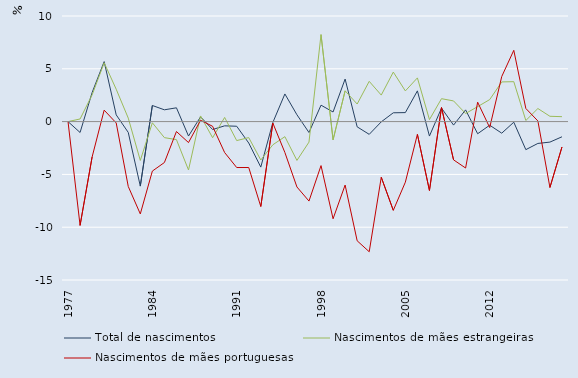
| Category | Total de nascimentos | Nascimentos de mães estrangeiras | Nascimentos de mães portuguesas |
|---|---|---|---|
| 1977.0 | 0 | 0 | 0 |
| 1978.0 | -1.031 | 0.249 | -9.831 |
| 1979.0 | 2.753 | 2.528 | -3.349 |
| 1980.0 | 5.681 | 5.57 | 1.086 |
| 1981.0 | 0.638 | 3.065 | -0.129 |
| 1982.0 | -1.025 | 0.331 | -6.144 |
| 1983.0 | -6.108 | -3.681 | -8.741 |
| 1984.0 | 1.525 | -0.111 | -4.686 |
| 1985.0 | 1.117 | -1.519 | -3.875 |
| 1986.0 | 1.306 | -1.707 | -0.939 |
| 1987.0 | -1.367 | -4.581 | -1.986 |
| 1988.0 | 0.448 | 0.536 | 0.127 |
| 1989.0 | -0.751 | -1.527 | -0.444 |
| 1990.0 | -0.401 | 0.394 | -2.932 |
| 1991.0 | -0.44 | -1.797 | -4.349 |
| 1992.0 | -2.029 | -1.515 | -4.348 |
| 1993.0 | -4.31 | -3.634 | -8.04 |
| 1994.0 | -0.087 | -2.196 | -0.139 |
| 1995.0 | 2.618 | -1.426 | -2.927 |
| 1996.0 | 0.648 | -3.677 | -6.191 |
| 1997.0 | -1.031 | -1.943 | -7.525 |
| 1998.0 | 1.556 | 8.239 | -4.167 |
| 1999.0 | 0.909 | -1.725 | -9.201 |
| 2000.0 | 4.027 | 2.915 | -6.009 |
| 2001.0 | -0.495 | 1.664 | -11.286 |
| 2002.0 | -1.208 | 3.812 | -12.324 |
| 2003.0 | -0.022 | 2.511 | -5.269 |
| 2004.0 | 0.834 | 4.69 | -8.403 |
| 2005.0 | 0.852 | 2.905 | -5.736 |
| 2006.0 | 2.911 | 4.138 | -1.209 |
| 2007.0 | -1.369 | 0.189 | -6.521 |
| 2008.0 | 1.28 | 2.17 | 1.331 |
| 2009.0 | -0.33 | 1.957 | -3.622 |
| 2010.0 | 1.11 | 0.768 | -4.396 |
| 2011.0 | -1.15 | 1.416 | 1.839 |
| 2012.0 | -0.341 | 2.084 | -0.564 |
| 2013.0 | -1.097 | 3.756 | 4.268 |
| 2014.0 | -0.058 | 3.782 | 6.749 |
| 2015.0 | -2.656 | 0.104 | 1.244 |
| 2016.0 | -2.068 | 1.239 | 0.06 |
| 2017.0 | -1.941 | 0.502 | -6.241 |
| 2018.0 | -1.439 | 0.468 | -2.405 |